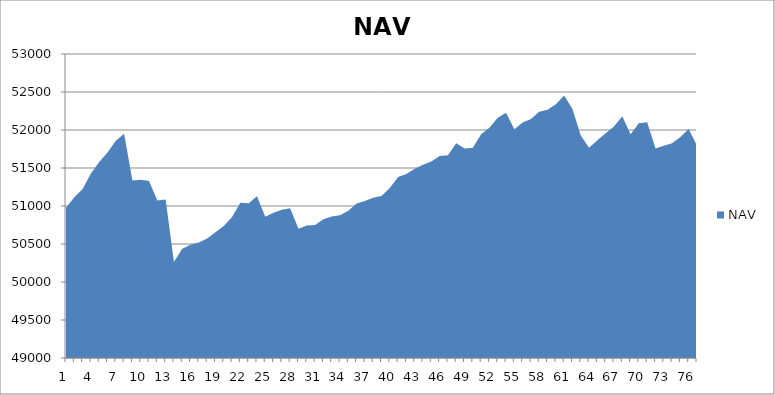
| Category | NAV |
|---|---|
| 0 | 50975.413 |
| 1 | 51115.874 |
| 2 | 51223.542 |
| 3 | 51427.364 |
| 4 | 51580.567 |
| 5 | 51704.692 |
| 6 | 51858.016 |
| 7 | 51951.766 |
| 8 | 51336.067 |
| 9 | 51345.356 |
| 10 | 51328.667 |
| 11 | 51072.985 |
| 12 | 51085.199 |
| 13 | 50261.67 |
| 14 | 50438.394 |
| 15 | 50489.896 |
| 16 | 50518.251 |
| 17 | 50572.468 |
| 18 | 50655.55 |
| 19 | 50737.787 |
| 20 | 50856.035 |
| 21 | 51041.806 |
| 22 | 51034.925 |
| 23 | 51128.589 |
| 24 | 50859.456 |
| 25 | 50911.137 |
| 26 | 50950.007 |
| 27 | 50970.175 |
| 28 | 50701.326 |
| 29 | 50743.495 |
| 30 | 50751.546 |
| 31 | 50826.725 |
| 32 | 50860.533 |
| 33 | 50879.283 |
| 34 | 50936.644 |
| 35 | 51031.381 |
| 36 | 51065.306 |
| 37 | 51109.987 |
| 38 | 51132.251 |
| 39 | 51238.242 |
| 40 | 51380.786 |
| 41 | 51420.042 |
| 42 | 51490.787 |
| 43 | 51541.14 |
| 44 | 51584.924 |
| 45 | 51657.998 |
| 46 | 51667.348 |
| 47 | 51825.763 |
| 48 | 51755.412 |
| 49 | 51767.57 |
| 50 | 51945.15 |
| 51 | 52028.391 |
| 52 | 52160.744 |
| 53 | 52227.009 |
| 54 | 52009.927 |
| 55 | 52099.094 |
| 56 | 52144.26 |
| 57 | 52240.689 |
| 58 | 52266.163 |
| 59 | 52339.405 |
| 60 | 52453.236 |
| 61 | 52275.154 |
| 62 | 51926 |
| 63 | 51766.425 |
| 64 | 51865.11 |
| 65 | 51955.727 |
| 66 | 52045.452 |
| 67 | 52179.744 |
| 68 | 51944.5 |
| 69 | 52088.896 |
| 70 | 52102.813 |
| 71 | 51756.659 |
| 72 | 51793.477 |
| 73 | 51824.02 |
| 74 | 51909.314 |
| 75 | 52012.255 |
| 76 | 51792.924 |